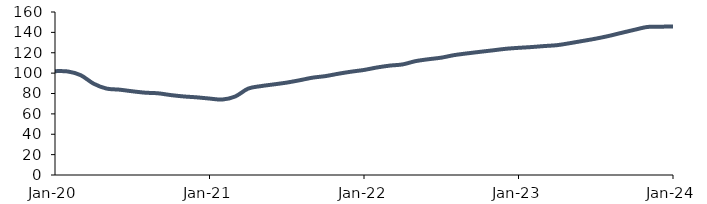
| Category | Series 0 |
|---|---|
| 2020-01-01 | 101.951 |
| 2020-02-01 | 101.62 |
| 2020-03-01 | 97.938 |
| 2020-04-01 | 89.65 |
| 2020-05-01 | 84.839 |
| 2020-06-01 | 83.781 |
| 2020-07-01 | 82.182 |
| 2020-08-01 | 80.808 |
| 2020-09-01 | 80.198 |
| 2020-10-01 | 78.439 |
| 2020-11-01 | 77.102 |
| 2020-12-01 | 76.237 |
| 2021-01-01 | 75.045 |
| 2021-02-01 | 74.096 |
| 2021-03-01 | 77.079 |
| 2021-04-01 | 84.788 |
| 2021-05-01 | 87.267 |
| 2021-06-01 | 88.947 |
| 2021-07-01 | 90.706 |
| 2021-08-01 | 93 |
| 2021-09-01 | 95.533 |
| 2021-10-01 | 97.064 |
| 2021-11-01 | 99.379 |
| 2021-12-01 | 101.416 |
| 2022-01-01 | 103.119 |
| 2022-02-01 | 105.529 |
| 2022-03-01 | 107.371 |
| 2022-04-01 | 108.553 |
| 2022-05-01 | 111.761 |
| 2022-06-01 | 113.626 |
| 2022-07-01 | 115.177 |
| 2022-08-01 | 117.668 |
| 2022-09-01 | 119.358 |
| 2022-10-01 | 120.89 |
| 2022-11-01 | 122.346 |
| 2022-12-01 | 123.861 |
| 2023-01-01 | 124.823 |
| 2023-02-01 | 125.58 |
| 2023-03-01 | 126.574 |
| 2023-04-01 | 127.453 |
| 2023-05-01 | 129.424 |
| 2023-06-01 | 131.612 |
| 2023-07-01 | 133.833 |
| 2023-08-01 | 136.462 |
| 2023-09-01 | 139.531 |
| 2023-10-01 | 142.523 |
| 2023-11-01 | 145.297 |
| 2023-12-01 | 145.546 |
| 2024-01-01 | 145.879 |